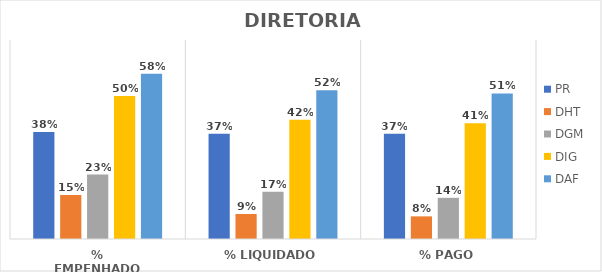
| Category | PR | DHT | DGM | DIG | DAF |
|---|---|---|---|---|---|
| % EMPENHADO | 0.377 | 0.154 | 0.227 | 0.503 | 0.582 |
| % LIQUIDADO | 0.37 | 0.088 | 0.166 | 0.42 | 0.523 |
| % PAGO | 0.37 | 0.08 | 0.145 | 0.407 | 0.512 |